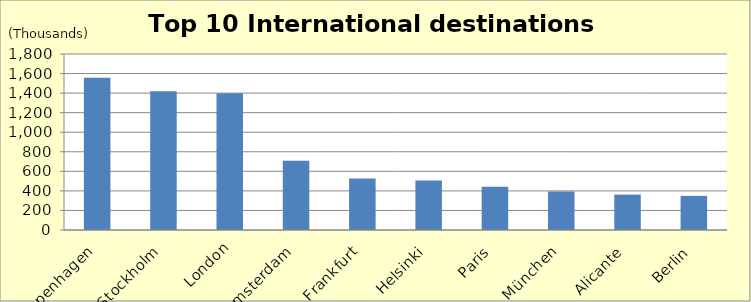
| Category | Number of passengers |
|---|---|
| Copenhagen | 1557.631 |
| Stockholm | 1419.831 |
| London | 1398.707 |
| Amsterdam | 707.94 |
| Frankfurt | 525.815 |
| Helsinki | 506.016 |
| Paris | 442.544 |
| München | 393.956 |
| Alicante | 361.873 |
| Berlin | 348.982 |